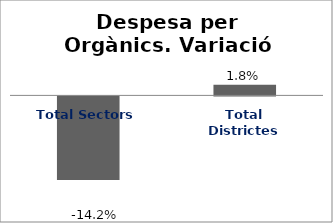
| Category | Series 0 |
|---|---|
| Total Sectors | -0.142 |
| Total Districtes | 0.018 |